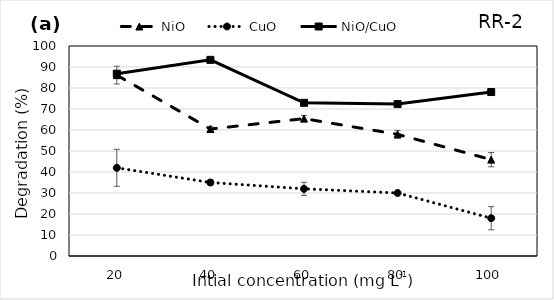
| Category | NiO  | CuO  | NiO/CuO  |
|---|---|---|---|
| 20.0 | 86.131 | 42 | 86.812 |
| 40.0 | 60.459 | 35 | 93.403 |
| 60.0 | 65.421 | 32 | 72.941 |
| 80.0 | 57.939 | 30 | 72.349 |
| 100.0 | 45.899 | 18 | 78.078 |